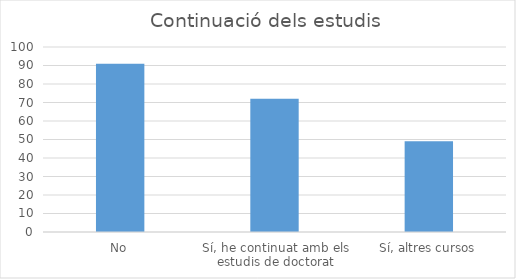
| Category | Series 0 |
|---|---|
| No | 91 |
| Sí, he continuat amb els estudis de doctorat | 72 |
| Sí, altres cursos | 49 |